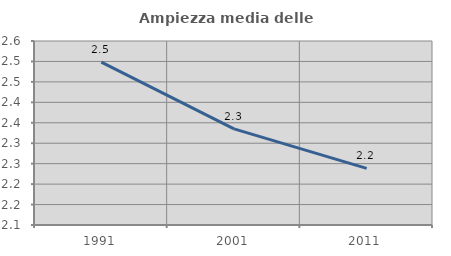
| Category | Ampiezza media delle famiglie |
|---|---|
| 1991.0 | 2.498 |
| 2001.0 | 2.335 |
| 2011.0 | 2.238 |